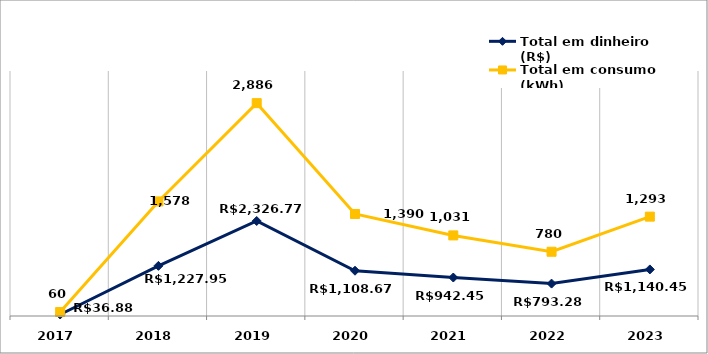
| Category | Total em dinheiro (R$) | Total em consumo (kWh) |
|---|---|---|
| 2017.0 | 36.88 | 60 |
| 2018.0 | 1227.95 | 1578 |
| 2019.0 | 2326.77 | 2886 |
| 2020.0 | 1108.67 | 1390.11 |
| 2021.0 | 942.45 | 1031 |
| 2022.0 | 793.28 | 780 |
| 2023.0 | 1140.45 | 1293 |